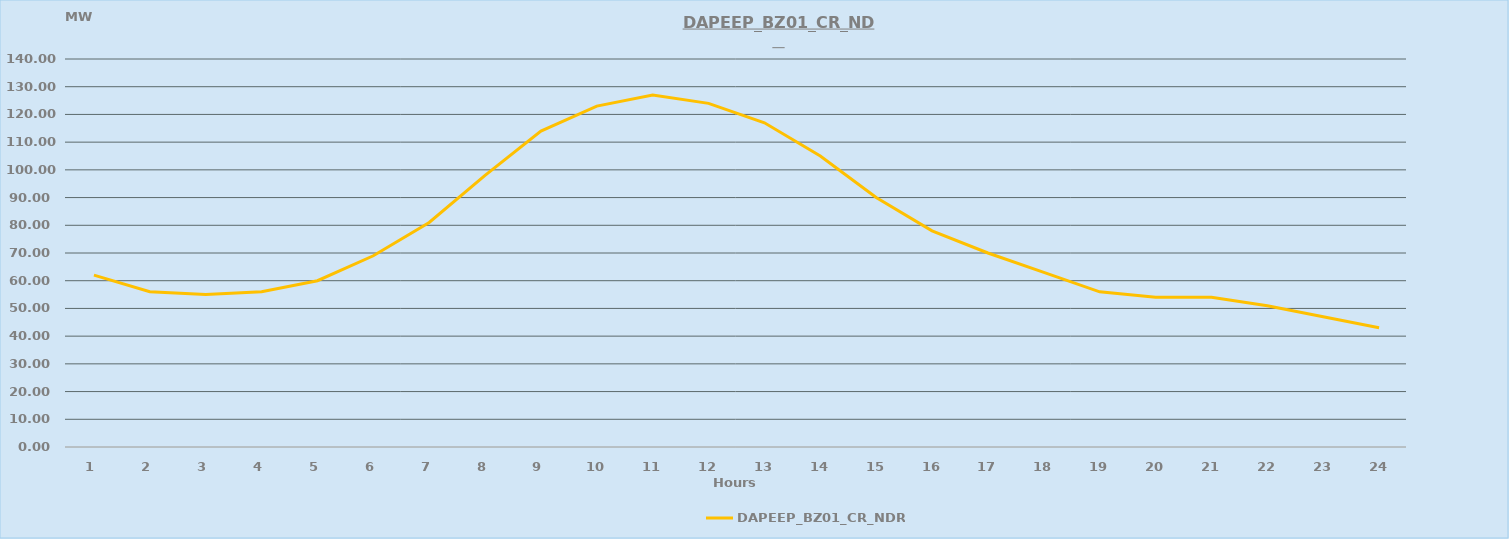
| Category | DAPEEP_BZ01_CR_NDR |
|---|---|
| 0 | 62 |
| 1 | 56 |
| 2 | 55 |
| 3 | 56 |
| 4 | 60 |
| 5 | 69 |
| 6 | 81 |
| 7 | 98 |
| 8 | 114 |
| 9 | 123 |
| 10 | 127 |
| 11 | 124 |
| 12 | 117 |
| 13 | 105 |
| 14 | 90 |
| 15 | 78 |
| 16 | 70 |
| 17 | 63 |
| 18 | 56 |
| 19 | 54 |
| 20 | 54 |
| 21 | 51 |
| 22 | 47 |
| 23 | 43 |